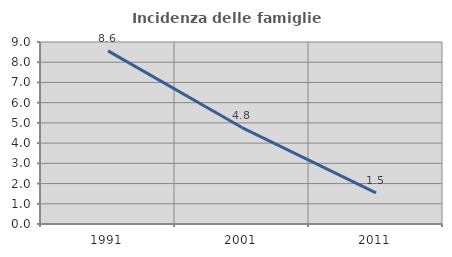
| Category | Incidenza delle famiglie numerose |
|---|---|
| 1991.0 | 8.559 |
| 2001.0 | 4.769 |
| 2011.0 | 1.541 |